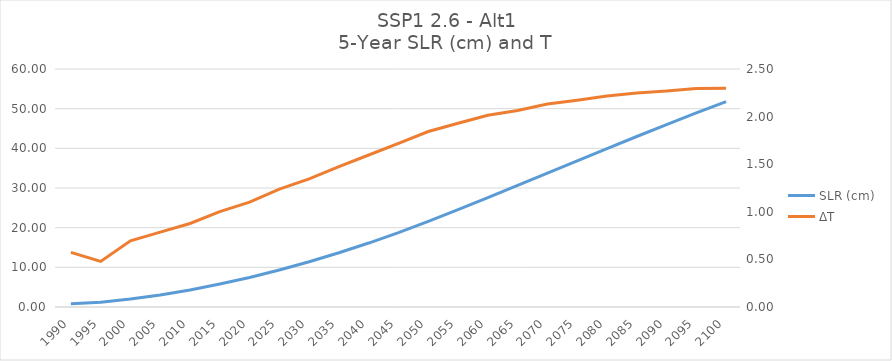
| Category | SLR (cm) |
|---|---|
| 1990.0 | 0.83 |
| 1995.0 | 1.225 |
| 2000.0 | 2.004 |
| 2005.0 | 3.047 |
| 2010.0 | 4.302 |
| 2015.0 | 5.786 |
| 2020.0 | 7.449 |
| 2025.0 | 9.339 |
| 2030.0 | 11.401 |
| 2035.0 | 13.668 |
| 2040.0 | 16.123 |
| 2045.0 | 18.766 |
| 2050.0 | 21.599 |
| 2055.0 | 24.541 |
| 2060.0 | 27.58 |
| 2065.0 | 30.636 |
| 2070.0 | 33.744 |
| 2075.0 | 36.837 |
| 2080.0 | 39.926 |
| 2085.0 | 42.98 |
| 2090.0 | 45.97 |
| 2095.0 | 48.914 |
| 2100.0 | 51.756 |